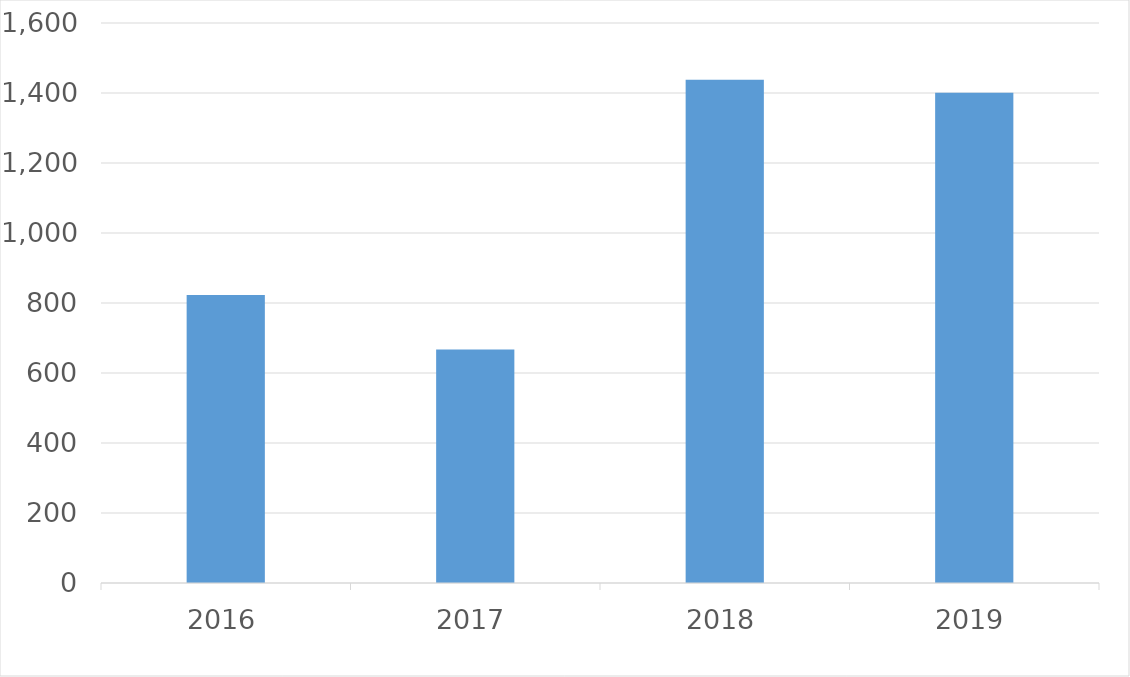
| Category | Series 0 |
|---|---|
| 2016 | 823 |
| 2017 | 667 |
| 2018 | 1438 |
| 2019 | 1401 |